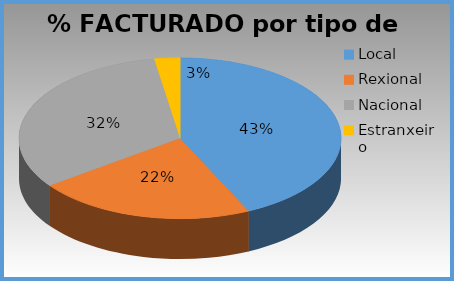
| Category | % facturado |
|---|---|
| Local | 0.43 |
| Rexional | 0.22 |
| Nacional | 0.325 |
| Estranxeiro | 0.026 |